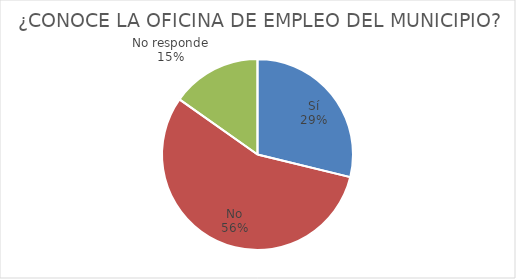
| Category | ¿CONOCE LA OFICINA DE EMPLEO DEL MUNICIPIO? |
|---|---|
| Sí | 53 |
| No | 103 |
| No responde | 28 |